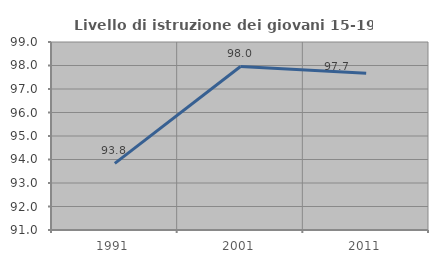
| Category | Livello di istruzione dei giovani 15-19 anni |
|---|---|
| 1991.0 | 93.833 |
| 2001.0 | 97.959 |
| 2011.0 | 97.674 |